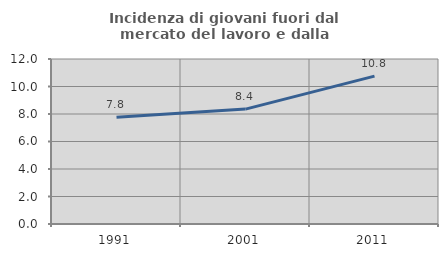
| Category | Incidenza di giovani fuori dal mercato del lavoro e dalla formazione  |
|---|---|
| 1991.0 | 7.765 |
| 2001.0 | 8.355 |
| 2011.0 | 10.752 |